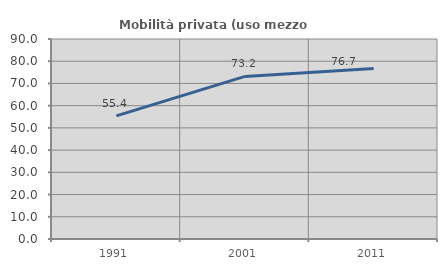
| Category | Mobilità privata (uso mezzo privato) |
|---|---|
| 1991.0 | 55.435 |
| 2001.0 | 73.171 |
| 2011.0 | 76.699 |